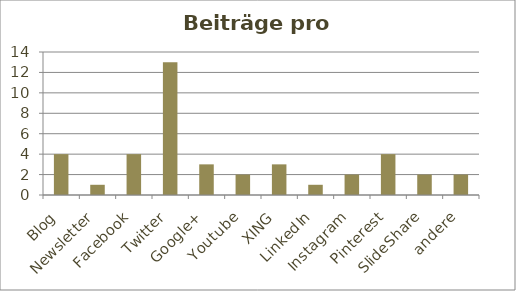
| Category | Beiträge |
|---|---|
| Blog | 4 |
| Newsletter | 1 |
| Facebook | 4 |
| Twitter | 13 |
| Google+ | 3 |
| Youtube | 2 |
| XING | 3 |
| LinkedIn | 1 |
| Instagram | 2 |
| Pinterest | 4 |
| SlideShare | 2 |
| andere | 2 |